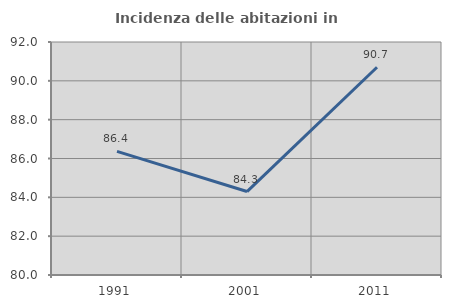
| Category | Incidenza delle abitazioni in proprietà  |
|---|---|
| 1991.0 | 86.364 |
| 2001.0 | 84.298 |
| 2011.0 | 90.698 |